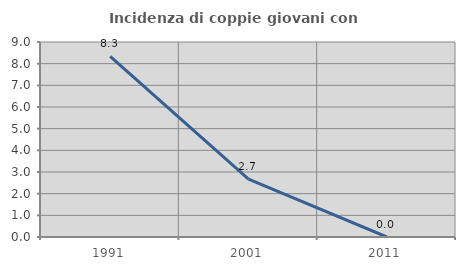
| Category | Incidenza di coppie giovani con figli |
|---|---|
| 1991.0 | 8.333 |
| 2001.0 | 2.667 |
| 2011.0 | 0 |